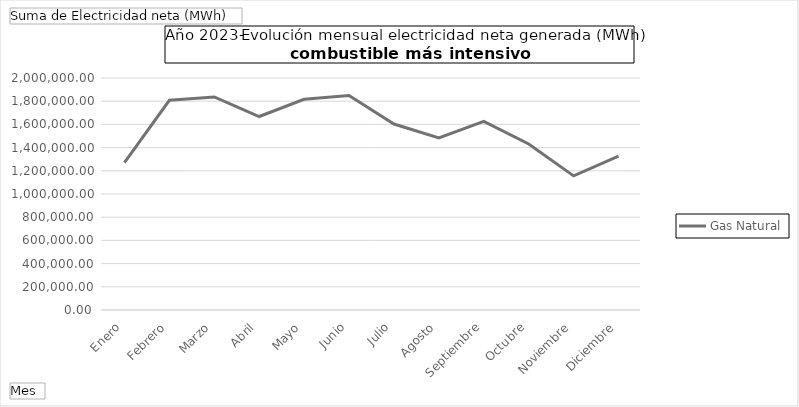
| Category | Gas Natural |
|---|---|
| Enero | 1269676.62 |
| Febrero | 1807902.16 |
| Marzo | 1836658.6 |
| Abril | 1667994.56 |
| Mayo | 1816198.75 |
| Junio | 1849814.63 |
| Julio | 1603337.06 |
| Agosto | 1484400.77 |
| Septiembre | 1626262.72 |
| Octubre | 1431423.18 |
| Noviembre | 1156478.76 |
| Diciembre | 1325555.53 |